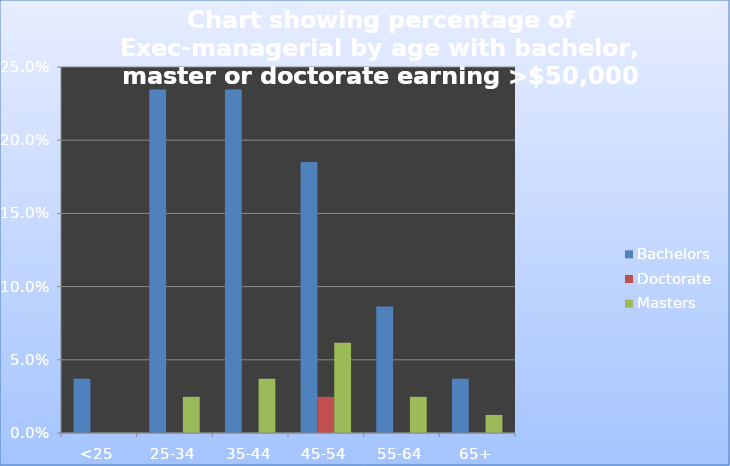
| Category | Exec-managerial - Bachelors | Exec-managerial - Doctorate | Exec-managerial - Masters |
|---|---|---|---|
| <25 | 0.037 | 0 | 0 |
| 25-34 | 0.235 | 0 | 0.025 |
| 35-44 | 0.235 | 0 | 0.037 |
| 45-54 | 0.185 | 0.025 | 0.062 |
| 55-64 | 0.086 | 0 | 0.025 |
| 65+ | 0.037 | 0 | 0.012 |